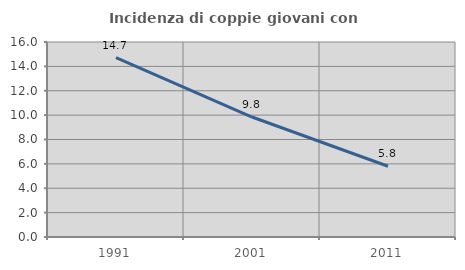
| Category | Incidenza di coppie giovani con figli |
|---|---|
| 1991.0 | 14.727 |
| 2001.0 | 9.846 |
| 2011.0 | 5.804 |